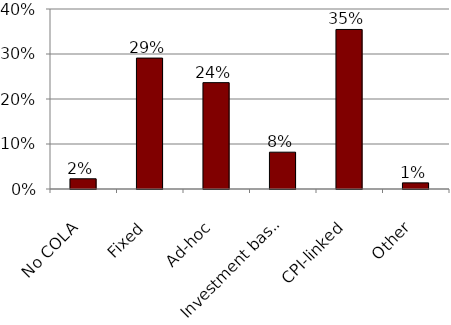
| Category | 2021 |
|---|---|
| No COLA | 0.023 |
| Fixed | 0.291 |
| Ad-hoc | 0.236 |
| Investment based | 0.082 |
| CPI-linked | 0.355 |
| Other | 0.014 |